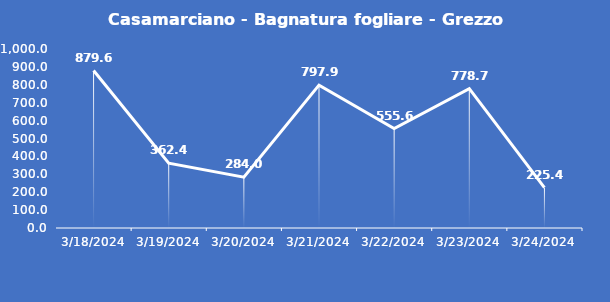
| Category | Casamarciano - Bagnatura fogliare - Grezzo (min) |
|---|---|
| 3/18/24 | 879.6 |
| 3/19/24 | 362.4 |
| 3/20/24 | 284 |
| 3/21/24 | 797.9 |
| 3/22/24 | 555.6 |
| 3/23/24 | 778.7 |
| 3/24/24 | 225.4 |